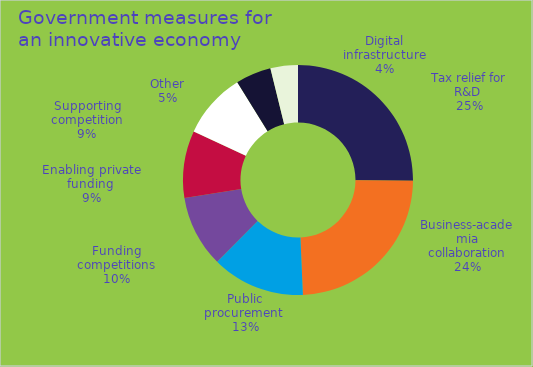
| Category | Series 0 |
|---|---|
| Tax relief for R&D  | 0.251 |
| Business-academia collaboration | 0.242 |
| Public procurement  | 0.131 |
| Funding competitions | 0.101 |
| Enabling private funding  | 0.094 |
| Supporting competition | 0.092 |
| Other | 0.05 |
| Digital infrastructure | 0.039 |